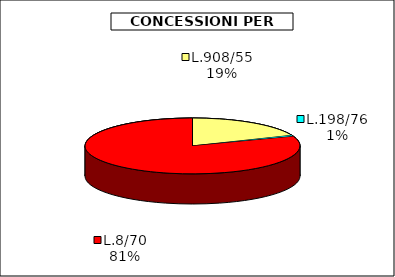
| Category | Series 0 |
|---|---|
| L.908/55 | 14589000 |
| L.198/76 | 512200 |
| L.8/70 | 62522750 |